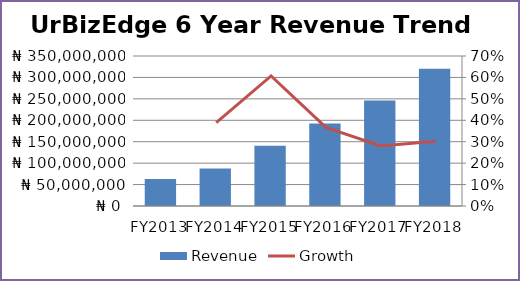
| Category | Revenue |
|---|---|
| FY2013 | 63000000 |
| FY2014 | 87500000 |
| FY2015 | 140625000 |
| FY2016 | 192260742.188 |
| FY2017 | 246093750 |
| FY2018 | 320434570.312 |